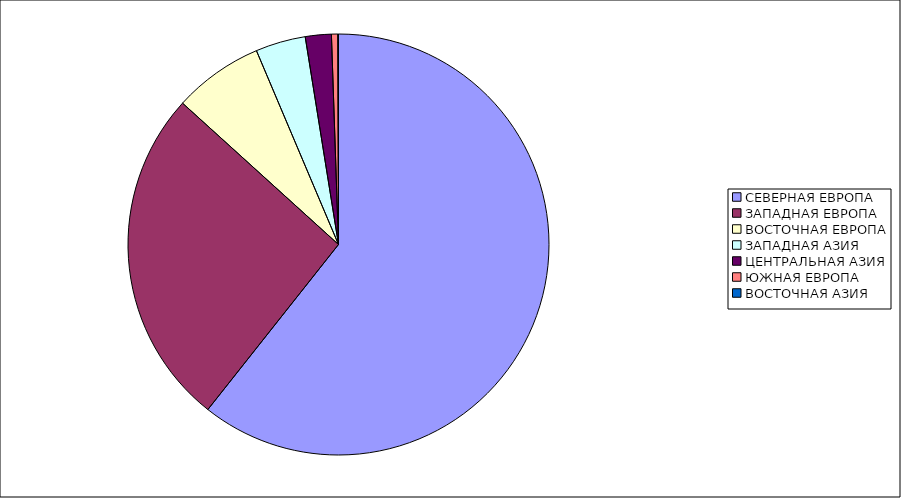
| Category | Оборот |
|---|---|
| СЕВЕРНАЯ ЕВРОПА | 60.656 |
| ЗАПАДНАЯ ЕВРОПА | 26.062 |
| ВОСТОЧНАЯ ЕВРОПА | 6.909 |
| ЗАПАДНАЯ АЗИЯ | 3.843 |
| ЦЕНТРАЛЬНАЯ АЗИЯ | 1.994 |
| ЮЖНАЯ ЕВРОПА | 0.486 |
| ВОСТОЧНАЯ АЗИЯ | 0.051 |